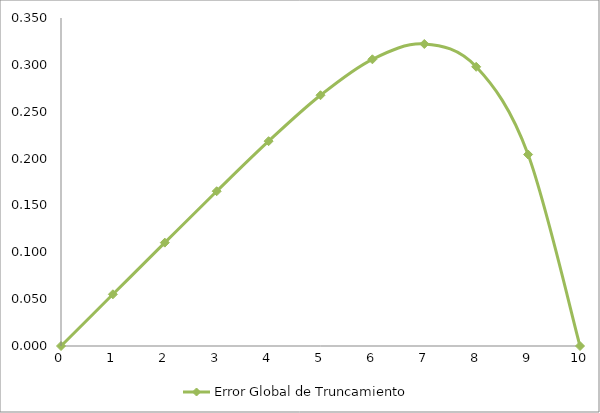
| Category | Error Global de Truncamiento |
|---|---|
| 0.0 | 0 |
| 1.0 | 0.055 |
| 2.0 | 0.11 |
| 3.0 | 0.165 |
| 4.0 | 0.219 |
| 5.0 | 0.268 |
| 6.0 | 0.306 |
| 7.0 | 0.322 |
| 8.0 | 0.298 |
| 9.0 | 0.204 |
| 10.0 | 0 |